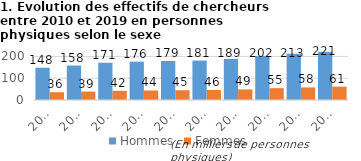
| Category | Hommes | Femmes |
|---|---|---|
| 2010 | 148.21 | 35.705 |
| 2011 | 158.357 | 38.699 |
| 2012 | 170.938 | 42.243 |
| 2013 | 176.108 | 43.651 |
| 2014 | 179.013 | 44.752 |
| 2015 | 181.019 | 45.819 |
| 2016 | 188.846 | 48.597 |
| 2017 | 201.561 | 54.592 |
| 2018 | 212.549 | 57.855 |
| 2019 (sd) | 221.335 | 61.262 |